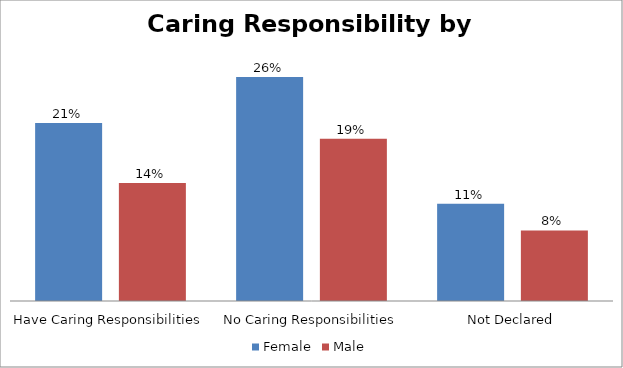
| Category | Female | Male |
|---|---|---|
| Have Caring Responsibilities | 0.209 | 0.139 |
| No Caring Responsibilities | 0.264 | 0.191 |
| Not Declared | 0.114 | 0.083 |